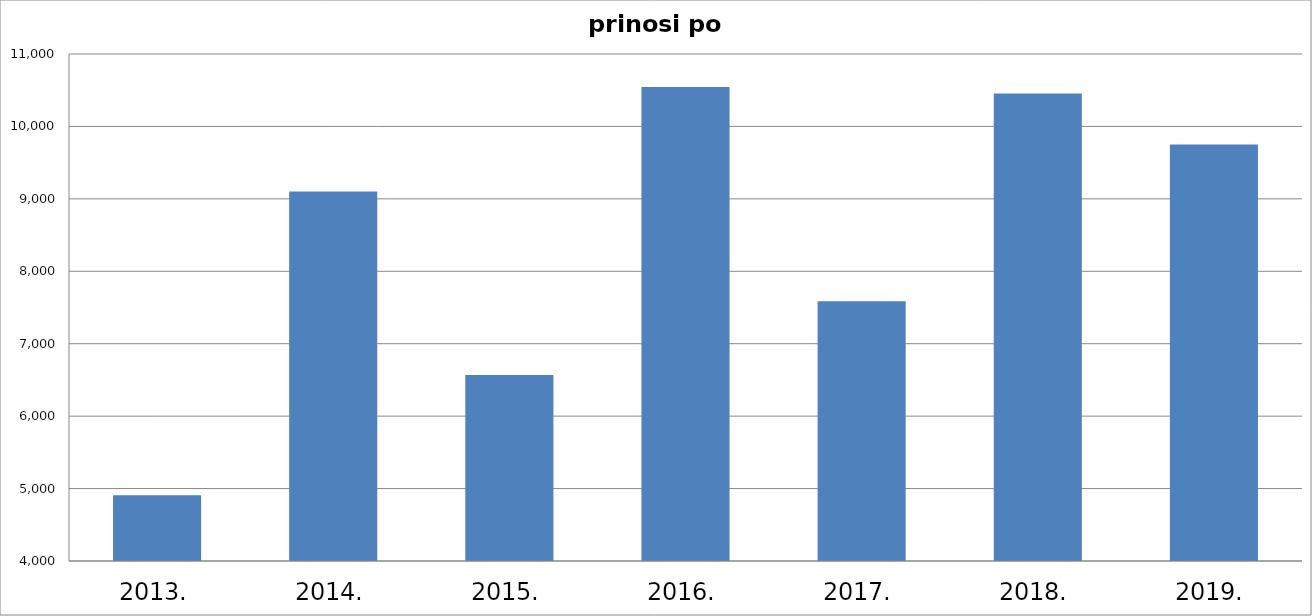
| Category | Series 0 |
|---|---|
| 2013. | 4907 |
| 2014. | 9101 |
| 2015. | 6568 |
| 2016. | 10544 |
| 2017. | 7587 |
| 2018. | 10456 |
| 2019. | 9752 |